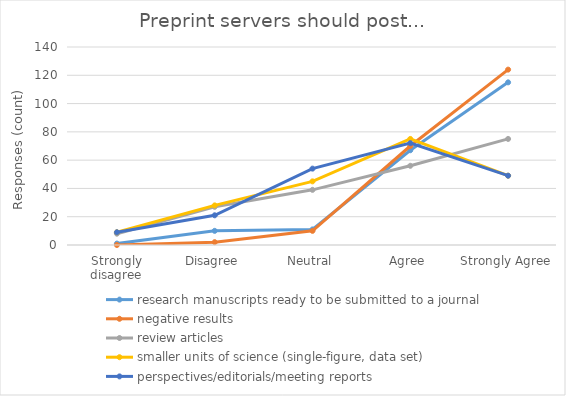
| Category | research manuscripts ready to be submitted to a journal | negative results | review articles | smaller units of science (single-figure, data set) | perspectives/editorials/meeting reports |
|---|---|---|---|---|---|
| Strongly disagree | 1 | 0 | 8 | 9 | 9 |
| Disagree | 10 | 2 | 27 | 28 | 21 |
| Neutral | 11 | 10 | 39 | 45 | 54 |
| Agree | 67 | 70 | 56 | 75 | 72 |
| Strongly Agree | 115 | 124 | 75 | 49 | 49 |